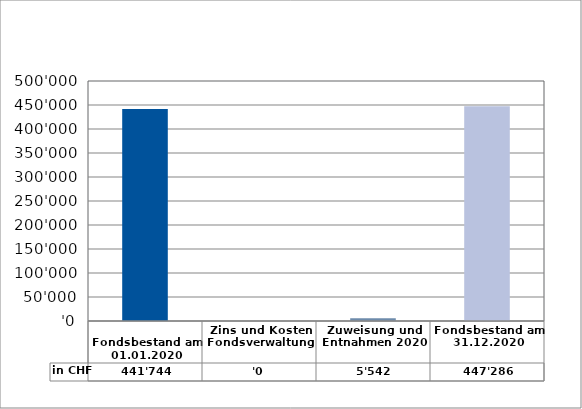
| Category | in CHF |
|---|---|
| 
Fondsbestand am 01.01.2020

 | 441744 |
| Zins und Kosten Fondsverwaltung | 0 |
| Zuweisung und Entnahmen 2020 | 5542.1 |
| Fondsbestand am 31.12.2020 | 447286.1 |